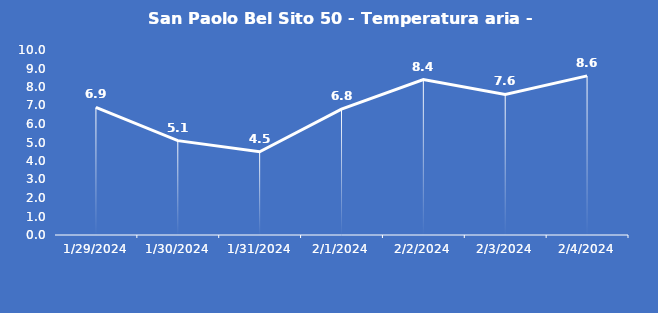
| Category | San Paolo Bel Sito 50 - Temperatura aria - Grezzo (°C) |
|---|---|
| 1/29/24 | 6.9 |
| 1/30/24 | 5.1 |
| 1/31/24 | 4.5 |
| 2/1/24 | 6.8 |
| 2/2/24 | 8.4 |
| 2/3/24 | 7.6 |
| 2/4/24 | 8.6 |